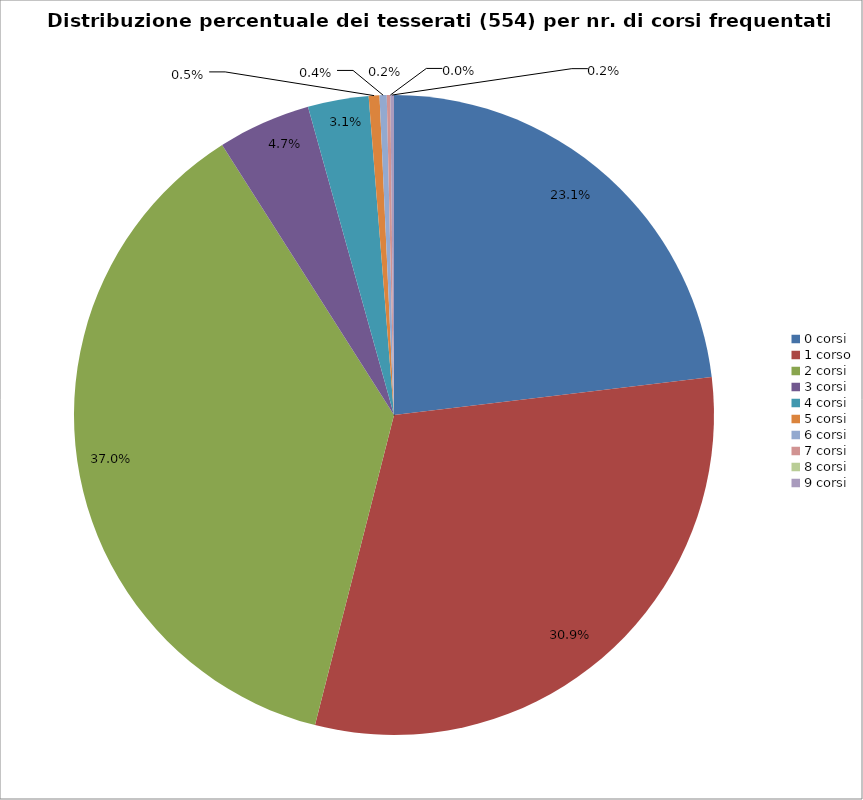
| Category | Nr. Tesserati |
|---|---|
| 0 corsi | 128 |
| 1 corso | 171 |
| 2 corsi | 205 |
| 3 corsi | 26 |
| 4 corsi | 17 |
| 5 corsi | 3 |
| 6 corsi | 2 |
| 7 corsi | 1 |
| 8 corsi | 0 |
| 9 corsi | 1 |